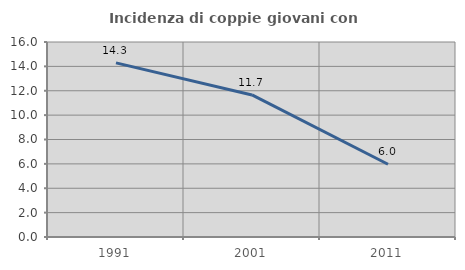
| Category | Incidenza di coppie giovani con figli |
|---|---|
| 1991.0 | 14.286 |
| 2001.0 | 11.656 |
| 2011.0 | 5.97 |